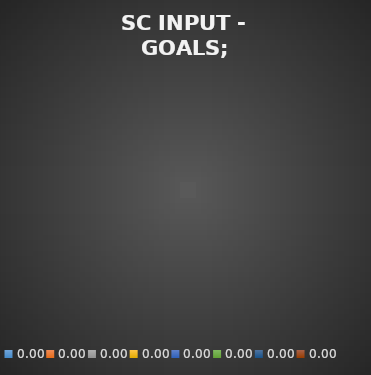
| Category | Series 0 |
|---|---|
| 0.0 | 0 |
| 0.0 | 0 |
| 0.0 | 0 |
| 0.0 | 0 |
| 0.0 | 0 |
| 0.0 | 0 |
| 0.0 | 0 |
| 0.0 | 0 |